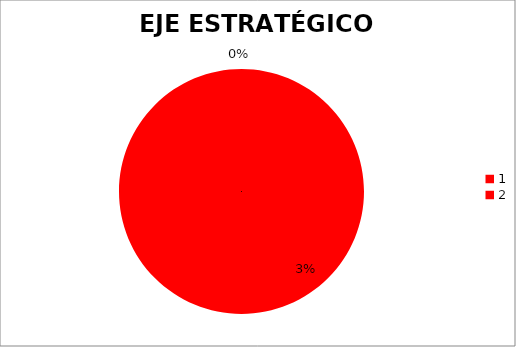
| Category | Series 0 |
|---|---|
| 0 | 0.03 |
| 1 | 0 |